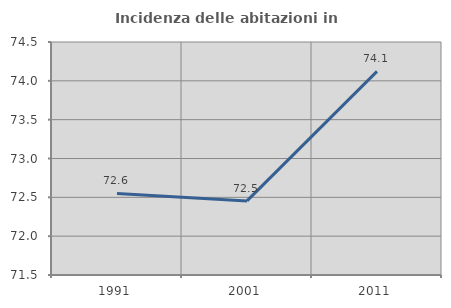
| Category | Incidenza delle abitazioni in proprietà  |
|---|---|
| 1991.0 | 72.55 |
| 2001.0 | 72.454 |
| 2011.0 | 74.121 |